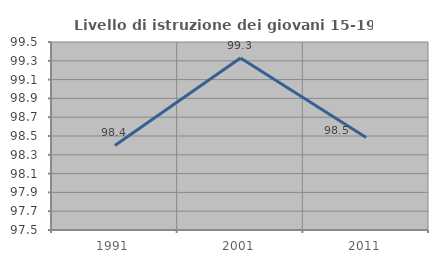
| Category | Livello di istruzione dei giovani 15-19 anni |
|---|---|
| 1991.0 | 98.4 |
| 2001.0 | 99.329 |
| 2011.0 | 98.485 |